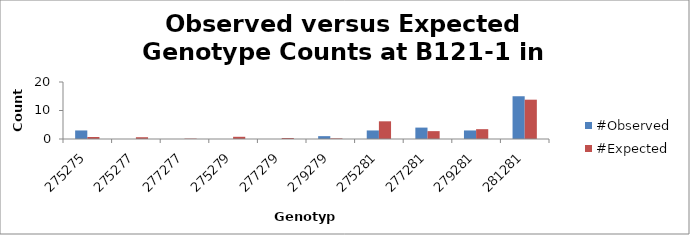
| Category | #Observed | #Expected |
|---|---|---|
| 275275.0 | 3 | 0.698 |
| 275277.0 | 0 | 0.621 |
| 277277.0 | 0 | 0.138 |
| 275279.0 | 0 | 0.776 |
| 277279.0 | 0 | 0.345 |
| 279279.0 | 1 | 0.216 |
| 275281.0 | 3 | 6.207 |
| 277281.0 | 4 | 2.759 |
| 279281.0 | 3 | 3.448 |
| 281281.0 | 15 | 13.793 |